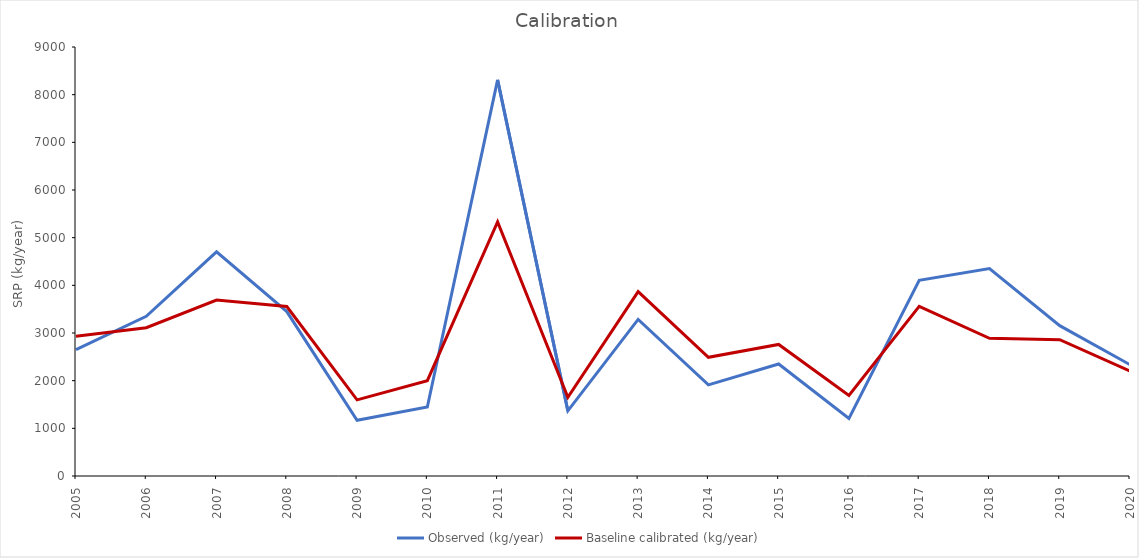
| Category | Observed (kg/year) | Baseline calibrated (kg/year) |
|---|---|---|
| 2005.0 | 2652.12 | 2933 |
| 2006.0 | 3350.032 | 3111 |
| 2007.0 | 4702.552 | 3690 |
| 2008.0 | 3448.485 | 3555 |
| 2009.0 | 1167.889 | 1597 |
| 2010.0 | 1445.843 | 2001 |
| 2011.0 | 8311.517 | 5332 |
| 2012.0 | 1366.181 | 1651 |
| 2013.0 | 3285.777 | 3869 |
| 2014.0 | 1911.919 | 2490 |
| 2015.0 | 2350.774 | 2760 |
| 2016.0 | 1207.946 | 1692 |
| 2017.0 | 4105.16 | 3558 |
| 2018.0 | 4352.728 | 2889 |
| 2019.0 | 3153.891 | 2859 |
| 2020.0 | 2335.094 | 2202 |